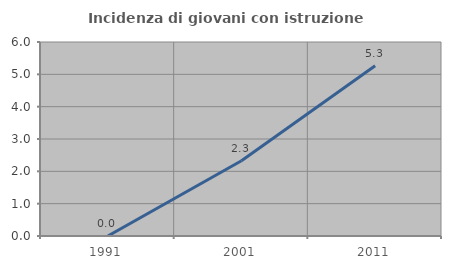
| Category | Incidenza di giovani con istruzione universitaria |
|---|---|
| 1991.0 | 0 |
| 2001.0 | 2.326 |
| 2011.0 | 5.263 |